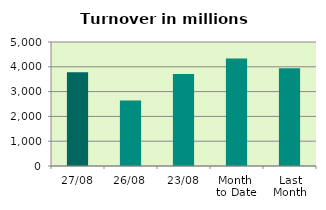
| Category | Series 0 |
|---|---|
| 27/08 | 3779.814 |
| 26/08 | 2643.571 |
| 23/08 | 3712.986 |
| Month 
to Date | 4338.555 |
| Last
Month | 3946.236 |